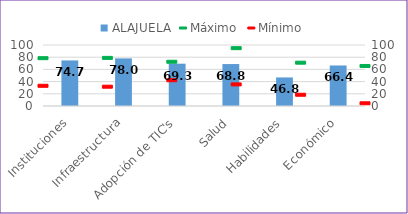
| Category | ALAJUELA |
|---|---|
| Instituciones | 74.716 |
| Infraestructura | 78.048 |
| Adopción de TIC's | 69.344 |
| Salud | 68.767 |
| Habilidades | 46.824 |
| Económico | 66.437 |